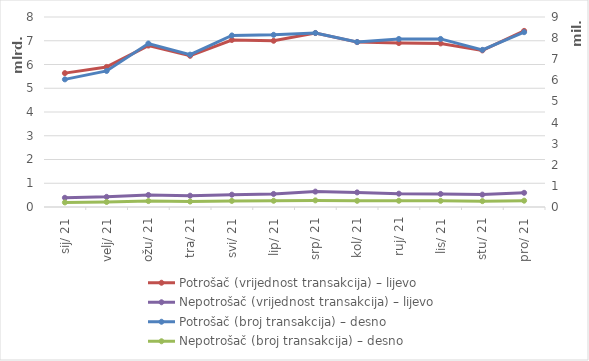
| Category | Potrošač (vrijednost transakcija) – lijevo | Nepotrošač (vrijednost transakcija) – lijevo |
|---|---|---|
| 2021-01-01 | 5636309868 | 387289805 |
| 2021-02-01 | 5897420527 | 427086747 |
| 2021-03-01 | 6796547745 | 507097338 |
| 2021-04-01 | 6366585351 | 476403668 |
| 2021-05-01 | 7032508094 | 519404389 |
| 2021-06-01 | 6998745516 | 550003516 |
| 2021-07-01 | 7324468893 | 648223925 |
| 2021-08-01 | 6943077552 | 615117451 |
| 2021-09-01 | 6902869067 | 560691871 |
| 2021-10-01 | 6888066540 | 550536428 |
| 2021-11-01 | 6593924119 | 521694154 |
| 2021-12-01 | 7415490215 | 597306695 |